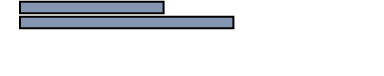
| Category | Series 0 |
|---|---|
| 0 | 40.221 |
| 1 | 59.779 |
| 2 | 0 |
| 3 | 0 |